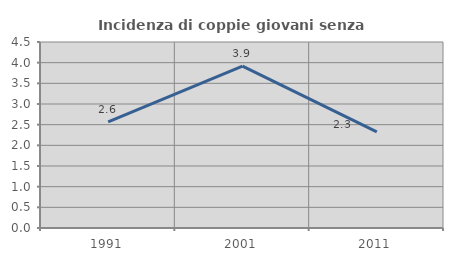
| Category | Incidenza di coppie giovani senza figli |
|---|---|
| 1991.0 | 2.569 |
| 2001.0 | 3.915 |
| 2011.0 | 2.326 |